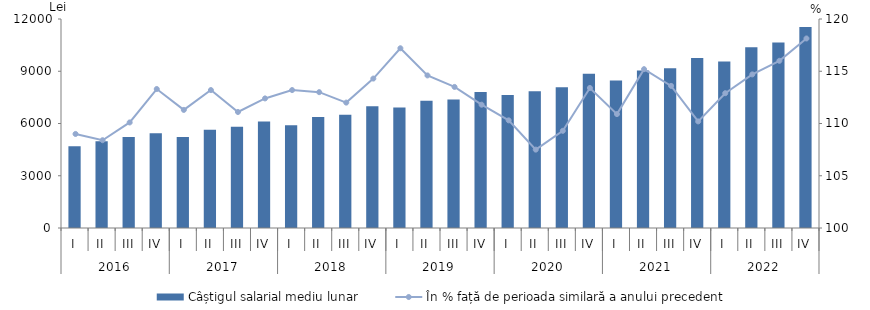
| Category | Câștigul salarial mediu lunar |
|---|---|
| 0 | 4689.2 |
| 1 | 4980.7 |
| 2 | 5229.2 |
| 3 | 5437.4 |
| 4 | 5218.9 |
| 5 | 5636.7 |
| 6 | 5809.1 |
| 7 | 6113.6 |
| 8 | 5906.5 |
| 9 | 6369.8 |
| 10 | 6507.3 |
| 11 | 6987.5 |
| 12 | 6923 |
| 13 | 7302.6 |
| 14 | 7385 |
| 15 | 7813.1 |
| 16 | 7633.9 |
| 17 | 7849 |
| 18 | 8074.3 |
| 19 | 8859.9 |
| 20 | 8468.6 |
| 21 | 9044.5 |
| 22 | 9175.7 |
| 23 | 9767.6 |
| 24 | 9560.8 |
| 25 | 10376.2 |
| 26 | 10648.1 |
| 27 | 11539.1 |